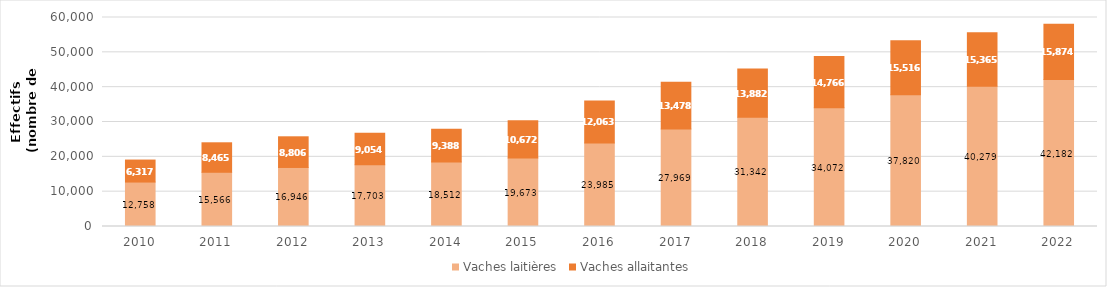
| Category | Vaches laitières | Vaches allaitantes |
|---|---|---|
| 2010.0 | 12758 | 6317 |
| 2011.0 | 15566 | 8465 |
| 2012.0 | 16946 | 8806 |
| 2013.0 | 17703 | 9054 |
| 2014.0 | 18512 | 9388 |
| 2015.0 | 19673 | 10672 |
| 2016.0 | 23985 | 12063 |
| 2017.0 | 27969 | 13478 |
| 2018.0 | 31342 | 13882 |
| 2019.0 | 34072 | 14766 |
| 2020.0 | 37820 | 15516 |
| 2021.0 | 40279 | 15365 |
| 2022.0 | 42182 | 15874 |